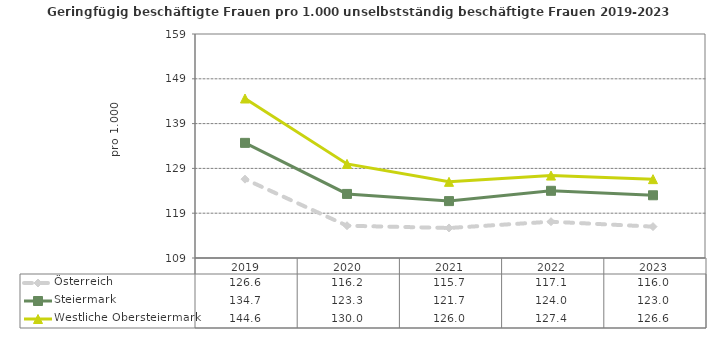
| Category | Österreich | Steiermark | Westliche Obersteiermark |
|---|---|---|---|
| 2023.0 | 116 | 123 | 126.6 |
| 2022.0 | 117.1 | 124 | 127.4 |
| 2021.0 | 115.7 | 121.7 | 126 |
| 2020.0 | 116.2 | 123.3 | 130 |
| 2019.0 | 126.6 | 134.7 | 144.6 |